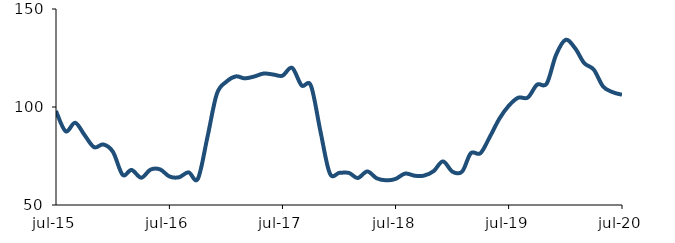
| Category | Series 0 |
|---|---|
| 2015-07-01 | 97.946 |
| 2015-08-01 | 87.63 |
| 2015-09-01 | 91.936 |
| 2015-10-01 | 85.728 |
| 2015-11-01 | 79.491 |
| 2015-12-01 | 80.893 |
| 2016-01-01 | 77.071 |
| 2016-02-01 | 65.426 |
| 2016-03-01 | 67.891 |
| 2016-04-01 | 63.911 |
| 2016-05-01 | 68.048 |
| 2016-06-01 | 68.16 |
| 2016-07-01 | 64.57 |
| 2016-08-01 | 64.147 |
| 2016-09-01 | 66.66 |
| 2016-10-01 | 63.408 |
| 2016-11-01 | 84.761 |
| 2016-12-01 | 106.615 |
| 2017-01-01 | 112.918 |
| 2017-02-01 | 115.622 |
| 2017-03-01 | 114.607 |
| 2017-04-01 | 115.562 |
| 2017-05-01 | 117.059 |
| 2017-06-01 | 116.58 |
| 2017-07-01 | 115.976 |
| 2017-08-01 | 119.999 |
| 2017-09-01 | 110.982 |
| 2017-10-01 | 110.817 |
| 2017-11-01 | 87.264 |
| 2017-12-01 | 66.1 |
| 2018-01-01 | 66.414 |
| 2018-02-01 | 66.344 |
| 2018-03-01 | 63.771 |
| 2018-04-01 | 67.126 |
| 2018-05-01 | 63.628 |
| 2018-06-01 | 62.591 |
| 2018-07-01 | 63.292 |
| 2018-08-01 | 66.042 |
| 2018-09-01 | 64.931 |
| 2018-10-01 | 65 |
| 2018-11-01 | 67.276 |
| 2018-12-01 | 72.256 |
| 2019-01-01 | 66.955 |
| 2019-02-01 | 67.065 |
| 2019-03-01 | 76.429 |
| 2019-04-01 | 76.411 |
| 2019-05-01 | 84.669 |
| 2019-06-01 | 93.974 |
| 2019-07-01 | 100.551 |
| 2019-08-01 | 104.741 |
| 2019-09-01 | 104.835 |
| 2019-10-01 | 111.409 |
| 2019-11-01 | 111.925 |
| 2019-12-01 | 126.529 |
| 2020-01-01 | 134.255 |
| 2020-02-01 | 129.901 |
| 2020-03-01 | 122.394 |
| 2020-04-01 | 119.057 |
| 2020-05-01 | 110.456 |
| 2020-06-01 | 107.554 |
| 2020-07-01 | 106.253 |